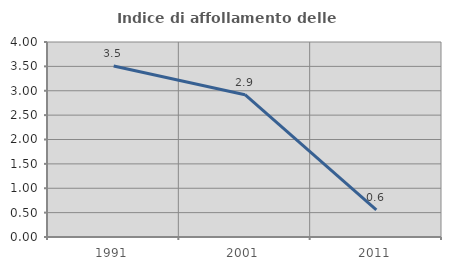
| Category | Indice di affollamento delle abitazioni  |
|---|---|
| 1991.0 | 3.509 |
| 2001.0 | 2.918 |
| 2011.0 | 0.557 |